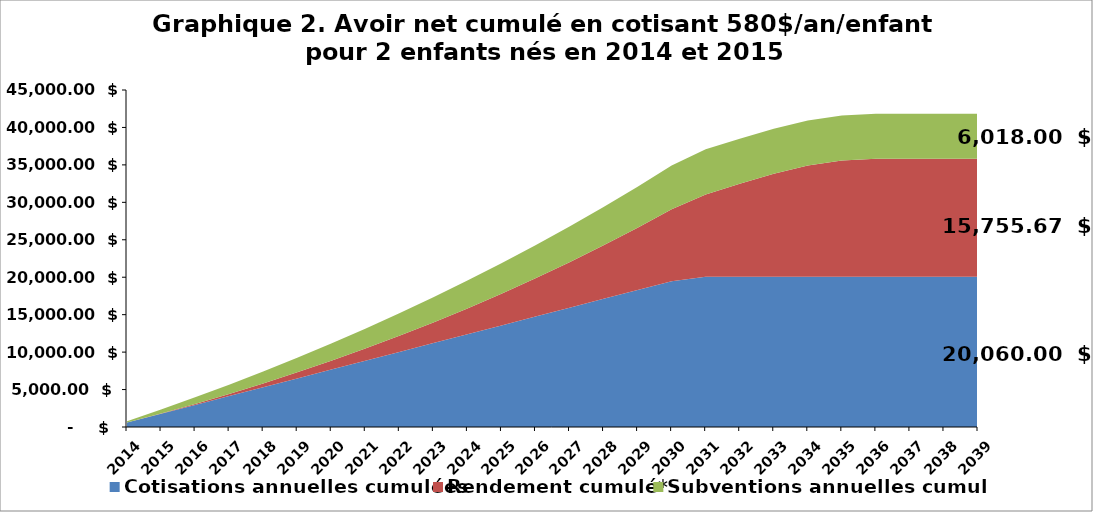
| Category | Cotisations annuelles cumulées | Rendement cumulé* | Subventions annuelles cumulées |
|---|---|---|---|
| 2014.0 | 590 | 0 | 177 |
| 2015.0 | 1770 | 30.68 | 531 |
| 2016.0 | 2950 | 123.947 | 885 |
| 2017.0 | 4130 | 282.305 | 1239 |
| 2018.0 | 5310 | 508.357 | 1593 |
| 2019.0 | 6490 | 804.812 | 1947 |
| 2020.0 | 7670 | 1174.484 | 2301 |
| 2021.0 | 8850 | 1620.303 | 2655 |
| 2022.0 | 10030 | 2145.316 | 3009 |
| 2023.0 | 11210 | 2752.688 | 3363 |
| 2024.0 | 12390 | 3445.716 | 3717 |
| 2025.0 | 13570 | 4227.824 | 4071 |
| 2026.0 | 14750 | 5102.577 | 4425 |
| 2027.0 | 15930 | 6073.68 | 4779 |
| 2028.0 | 17110 | 7144.988 | 5133 |
| 2029.0 | 18290 | 8320.507 | 5487 |
| 2030.0 | 19470 | 9604.407 | 5841 |
| 2031.0 | 20060 | 11001.024 | 6018 |
| 2032.0 | 20060 | 12416.917 | 6018 |
| 2033.0 | 20060 | 13752.22 | 6018 |
| 2034.0 | 20060 | 14844.888 | 6018 |
| 2035.0 | 20060 | 15520.096 | 6018 |
| 2036.0 | 20060 | 15751.922 | 6018 |
| 2037.0 | 20060 | 15753.123 | 6018 |
| 2038.0 | 20060 | 15754.371 | 6018 |
| 2039.0 | 20060 | 15755.669 | 6018 |